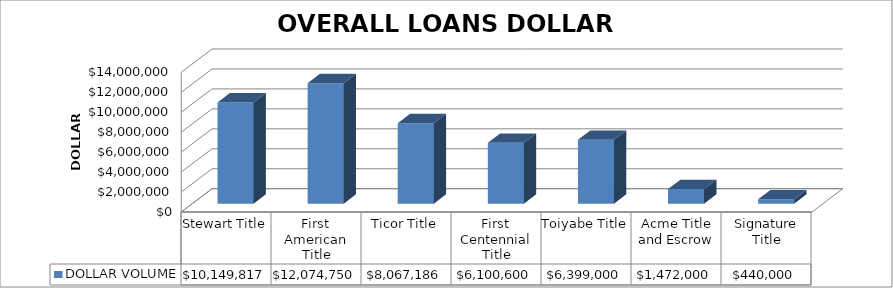
| Category | DOLLAR VOLUME |
|---|---|
| Stewart Title | 10149817 |
| First American Title | 12074750 |
| Ticor Title | 8067186 |
| First Centennial Title | 6100600 |
| Toiyabe Title | 6399000 |
| Acme Title and Escrow | 1472000 |
| Signature Title | 440000 |